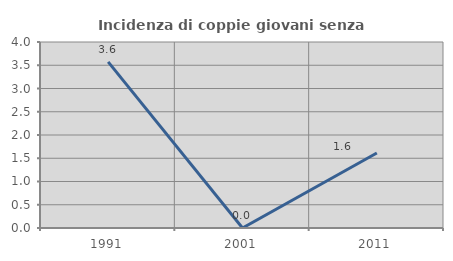
| Category | Incidenza di coppie giovani senza figli |
|---|---|
| 1991.0 | 3.571 |
| 2001.0 | 0 |
| 2011.0 | 1.613 |